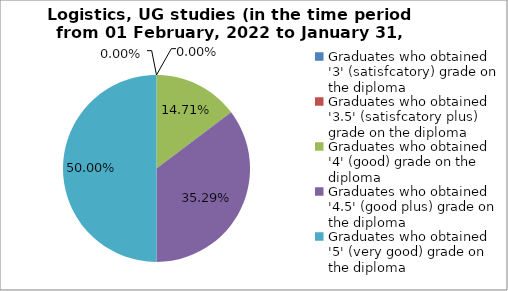
| Category | Series 0 |
|---|---|
| Graduates who obtained '3' (satisfcatory) grade on the diploma  | 0 |
| Graduates who obtained '3.5' (satisfcatory plus) grade on the diploma  | 0 |
| Graduates who obtained '4' (good) grade on the diploma  | 14.706 |
| Graduates who obtained '4.5' (good plus) grade on the diploma  | 35.294 |
| Graduates who obtained '5' (very good) grade on the diploma  | 50 |